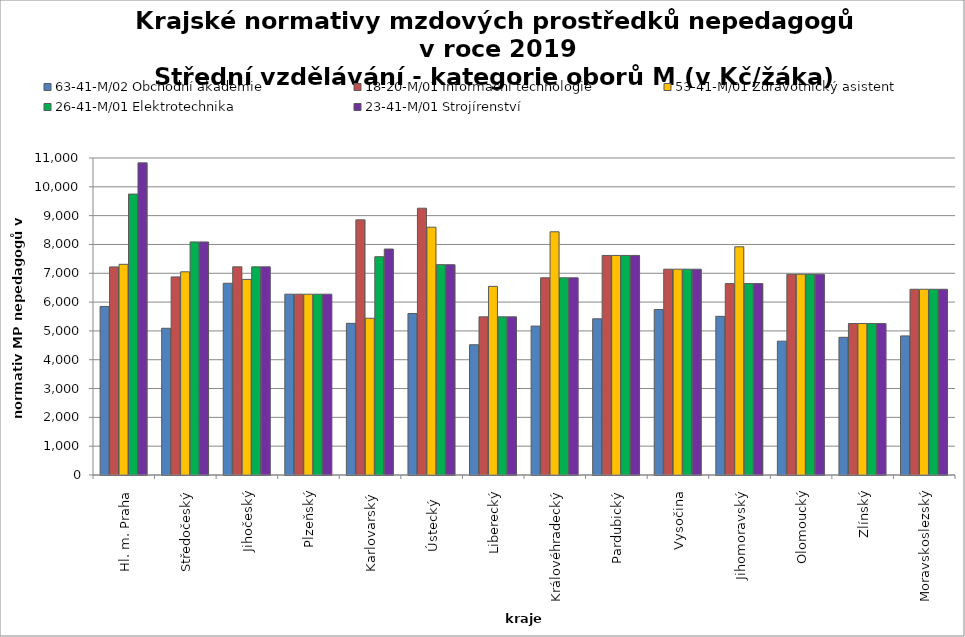
| Category | 63-41-M/02 Obchodní akademie | 18-20-M/01 Informační technologie | 53-41-M/01 Zdravotnický asistent | 26-41-M/01 Elektrotechnika | 23-41-M/01 Strojírenství |
|---|---|---|---|---|---|
| Hl. m. Praha | 5848.8 | 7220.741 | 7311 | 9748 | 10831.111 |
| Středočeský | 5091.778 | 6873.9 | 7050.154 | 8086.941 | 8086.941 |
| Jihočeský | 6653.053 | 7223.314 | 6787.331 | 7223.314 | 7223.314 |
| Plzeňský | 6274.286 | 6274.286 | 6274.286 | 6274.286 | 6274.286 |
| Karlovarský  | 5262.701 | 8853.178 | 5438.636 | 7575 | 7841.108 |
| Ústecký   | 5603.256 | 9258.228 | 8598.384 | 7298.036 | 7298.036 |
| Liberecký | 4519.364 | 5488.154 | 6545.121 | 5488.154 | 5488.154 |
| Královéhradecký | 5166.944 | 6842.485 | 8440.199 | 6842.485 | 6842.485 |
| Pardubický | 5420.769 | 7618.378 | 7618.378 | 7618.378 | 7618.378 |
| Vysočina | 5742.799 | 7141.48 | 7141.48 | 7141.48 | 7141.48 |
| Jihomoravský | 5505.826 | 6642.899 | 7918.687 | 6642.899 | 6642.899 |
| Olomoucký | 4643.892 | 6965.837 | 6965.837 | 6965.837 | 6965.837 |
| Zlínský | 4778.182 | 5256 | 5256 | 5256 | 5256 |
| Moravskoslezský | 4827.119 | 6445.059 | 6445.059 | 6445.059 | 6445.059 |